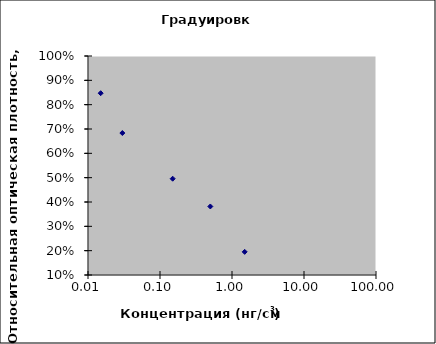
| Category | Series 0 |
|---|---|
| 0.015 | 0.847 |
| 0.03 | 0.683 |
| 0.15 | 0.496 |
| 0.5 | 0.382 |
| 1.5 | 0.195 |